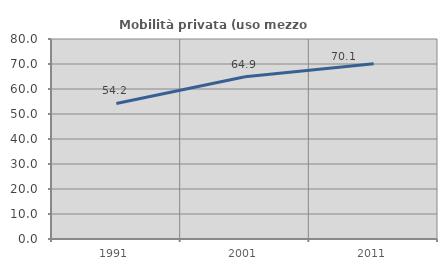
| Category | Mobilità privata (uso mezzo privato) |
|---|---|
| 1991.0 | 54.204 |
| 2001.0 | 64.927 |
| 2011.0 | 70.068 |